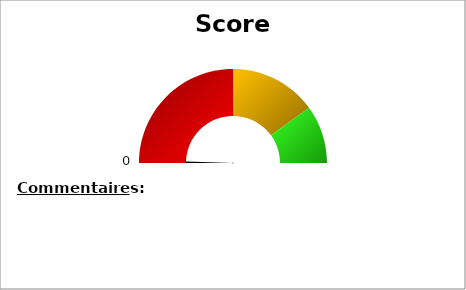
| Category | Series 1 |
|---|---|
| nan | 0 |
| 0.0 | 1 |
| nan | 199 |